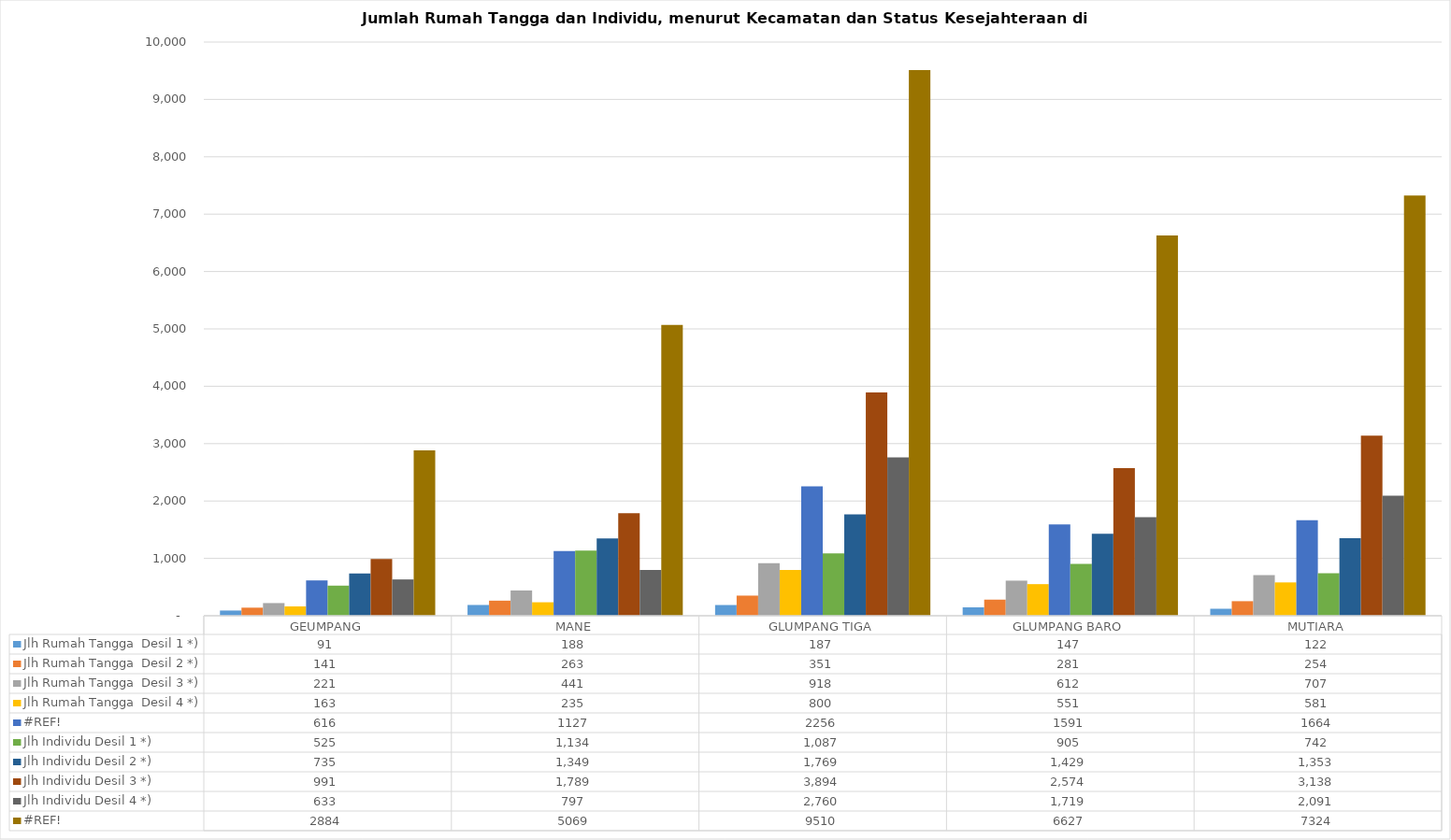
| Category | Jlh Rumah Tangga  Desil 1 *) | Jlh Rumah Tangga  Desil 2 *) | Jlh Rumah Tangga  Desil 3 *) | Jlh Rumah Tangga  Desil 4 *) | #REF! | Jlh Individu Desil 1 *) | Jlh Individu Desil 2 *) | Jlh Individu Desil 3 *) | Jlh Individu Desil 4 *) |
|---|---|---|---|---|---|---|---|---|---|
| GEUMPANG | 91 | 141 | 221 | 163 | 2884 | 525 | 735 | 991 | 633 |
| MANE | 188 | 263 | 441 | 235 | 5069 | 1134 | 1349 | 1789 | 797 |
| GLUMPANG TIGA | 187 | 351 | 918 | 800 | 9510 | 1087 | 1769 | 3894 | 2760 |
| GLUMPANG BARO | 147 | 281 | 612 | 551 | 6627 | 905 | 1429 | 2574 | 1719 |
| MUTIARA | 122 | 254 | 707 | 581 | 7324 | 742 | 1353 | 3138 | 2091 |